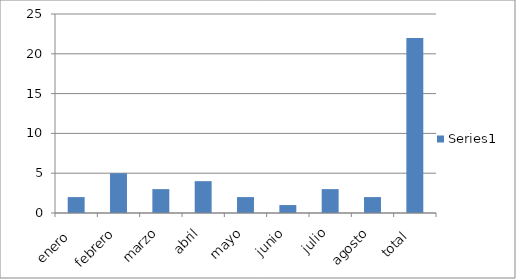
| Category | Series 0 |
|---|---|
| enero  | 2 |
| febrero | 5 |
| marzo | 3 |
| abril | 4 |
| mayo | 2 |
| junio | 1 |
| julio | 3 |
| agosto | 2 |
| total  | 22 |